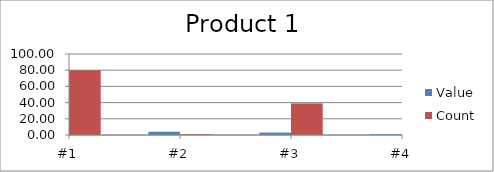
| Category | Value | Count |
|---|---|---|
| #1 | 5 | 80 |
| #2 | 4 | 1 |
| #3 | 3 | 39 |
| #4 | 1 | 38 |